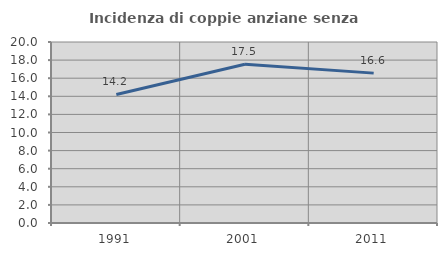
| Category | Incidenza di coppie anziane senza figli  |
|---|---|
| 1991.0 | 14.201 |
| 2001.0 | 17.544 |
| 2011.0 | 16.561 |